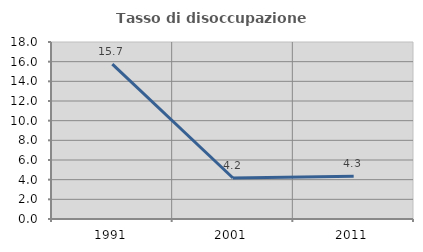
| Category | Tasso di disoccupazione giovanile  |
|---|---|
| 1991.0 | 15.741 |
| 2001.0 | 4.167 |
| 2011.0 | 4.348 |